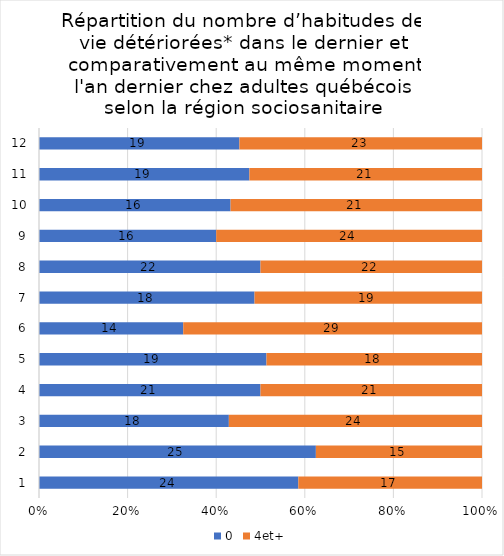
| Category | 0 | 4et+ |
|---|---|---|
| 0 | 24 | 17 |
| 1 | 25 | 15 |
| 2 | 18 | 24 |
| 3 | 21 | 21 |
| 4 | 19 | 18 |
| 5 | 14 | 29 |
| 6 | 18 | 19 |
| 7 | 22 | 22 |
| 8 | 16 | 24 |
| 9 | 16 | 21 |
| 10 | 19 | 21 |
| 11 | 19 | 23 |